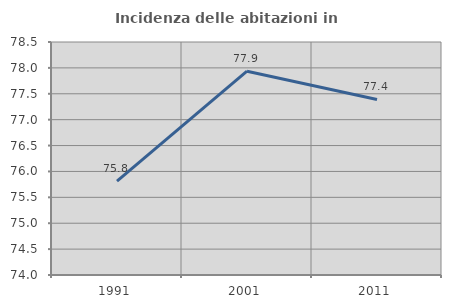
| Category | Incidenza delle abitazioni in proprietà  |
|---|---|
| 1991.0 | 75.812 |
| 2001.0 | 77.936 |
| 2011.0 | 77.39 |